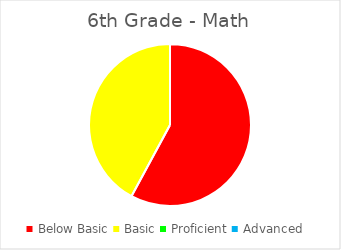
| Category | Series 0 |
|---|---|
| Below Basic | 0.579 |
| Basic | 0.421 |
| Proficient | 0 |
| Advanced | 0 |